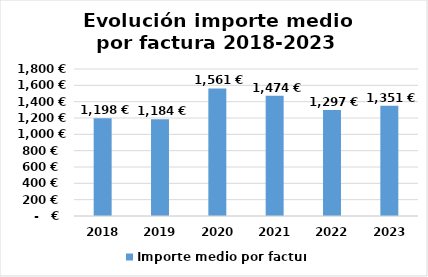
| Category | Importe medio por factura |
|---|---|
| 2018.0 | 1197.511 |
| 2019.0 | 1184.026 |
| 2020.0 | 1561.298 |
| 2021.0 | 1473.69 |
| 2022.0 | 1297.353 |
| 2023.0 | 1351.24 |